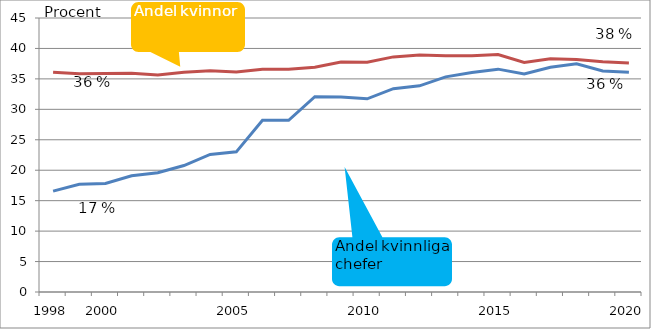
| Category | Andel kvinnliga chefer | Andel kvinnor totalt inom SN |
|---|---|---|
| 1998 | 16.562 | 36.092 |
|  | 17.697 | 35.834 |
| 2000 | 17.812 | 35.9 |
|  | 19.077 | 35.923 |
|  | 19.577 | 35.65 |
|  | 20.765 | 36.108 |
|  | 22.589 | 36.339 |
| 2005 | 23.016 | 36.133 |
|  | 28.199 | 36.589 |
|  | 28.199 | 36.589 |
|  | 32.075 | 36.916 |
|  | 32.036 | 37.777 |
| 2010 | 31.726 | 37.746 |
|  | 33.394 | 38.614 |
|  | 33.86 | 38.943 |
|  | 35.33 | 38.802 |
|  | 36.049 | 38.802 |
| 2015 | 36.6 | 39 |
|  | 35.8 | 37.7 |
|  | 36.9 | 38.3 |
|  | 37.49 | 38.2 |
|  | 36.3 | 37.8 |
| 2020 | 36.1 | 37.6 |